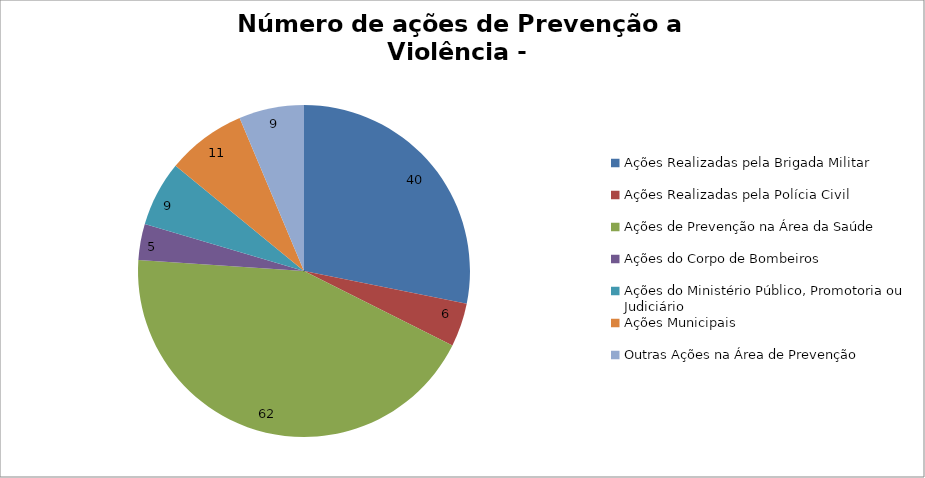
| Category | Número de Ações |
|---|---|
| Ações Realizadas pela Brigada Militar | 40 |
| Ações Realizadas pela Polícia Civil | 6 |
| Ações de Prevenção na Área da Saúde | 62 |
| Ações do Corpo de Bombeiros | 5 |
| Ações do Ministério Público, Promotoria ou Judiciário | 9 |
| Ações Municipais | 11 |
| Outras Ações na Área de Prevenção | 9 |